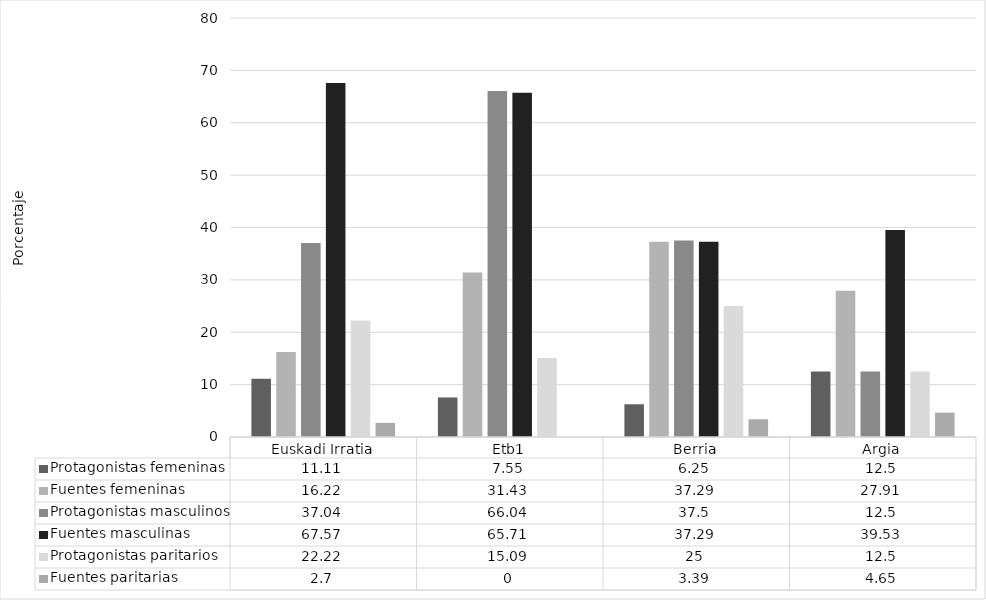
| Category | Protagonistas femeninas | Fuentes femeninas | Protagonistas masculinos | Fuentes masculinas | Protagonistas paritarios | Fuentes paritarias |
|---|---|---|---|---|---|---|
| Euskadi Irratia | 11.11 | 16.22 | 37.04 | 67.57 | 22.22 | 2.7 |
| Etb1 | 7.55 | 31.43 | 66.04 | 65.71 | 15.09 | 0 |
| Berria | 6.25 | 37.29 | 37.5 | 37.29 | 25 | 3.39 |
| Argia | 12.5 | 27.91 | 12.5 | 39.53 | 12.5 | 4.65 |